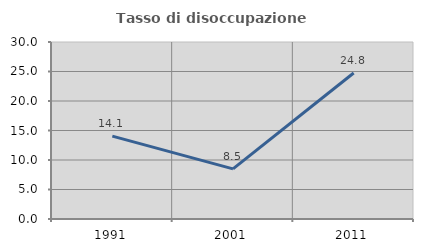
| Category | Tasso di disoccupazione giovanile  |
|---|---|
| 1991.0 | 14.054 |
| 2001.0 | 8.5 |
| 2011.0 | 24.75 |